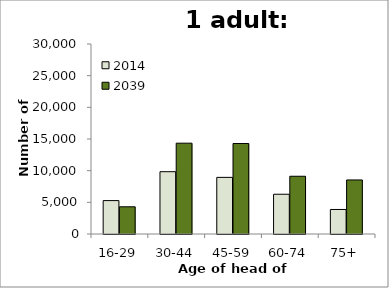
| Category | 2014 | 2039 |
|---|---|---|
| 16-29 | 5276 | 4296 |
| 30-44 | 9837 | 14340 |
| 45-59 | 8943 | 14287 |
| 60-74 | 6278 | 9116 |
| 75+ | 3873 | 8535 |